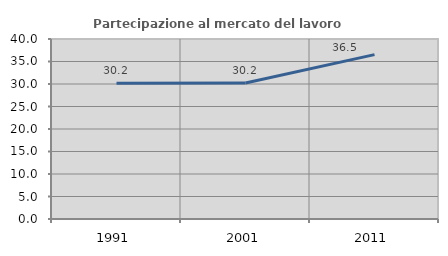
| Category | Partecipazione al mercato del lavoro  femminile |
|---|---|
| 1991.0 | 30.181 |
| 2001.0 | 30.242 |
| 2011.0 | 36.531 |